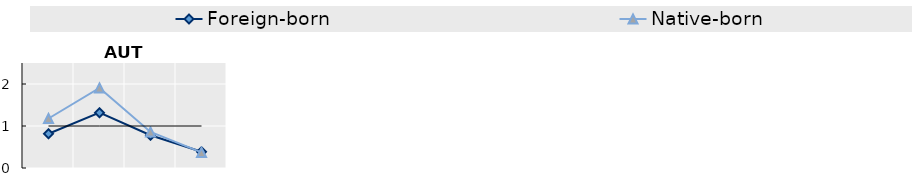
| Category | Foreign-born | Native-born | Series 1 |
|---|---|---|---|
| 15-24 | 0.816 | 1.178 | 1 |
| 25-54 | 1.317 | 1.907 | 1 |
| 55-64 | 0.779 | 0.86 | 1 |
| 65+ | 0.386 | 0.371 | 1 |